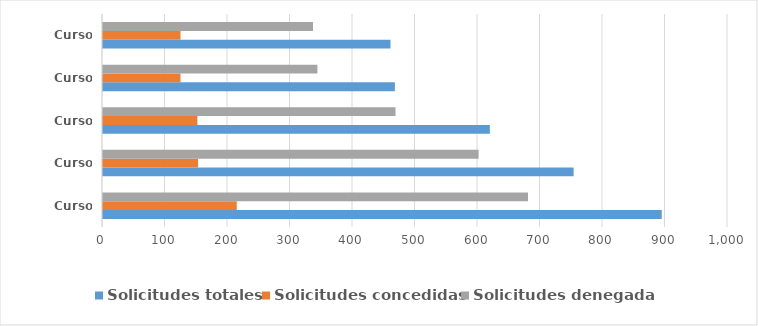
| Category | Solicitudes totales | Solicitudes concedidas | Solicitudes denegadas |
|---|---|---|---|
| Curso 2018-19 | 894 | 214 | 680 |
| Curso 2019-20 | 753 | 152 | 601 |
| Curso 2020-21 | 619 | 151 | 468 |
| Curso 2021-22 | 467 | 124 | 343 |
| Curso 2022-23 | 460 | 124 | 336 |